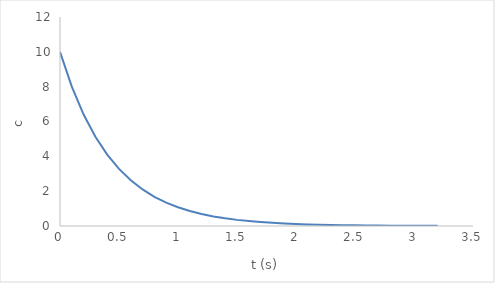
| Category | c |
|---|---|
| 0.0 | 10 |
| 0.1 | 8 |
| 0.2 | 6.4 |
| 0.30000000000000004 | 5.12 |
| 0.4 | 4.096 |
| 0.5 | 3.277 |
| 0.6 | 2.621 |
| 0.7 | 2.097 |
| 0.7999999999999999 | 1.678 |
| 0.8999999999999999 | 1.342 |
| 0.9999999999999999 | 1.074 |
| 1.0999999999999999 | 0.859 |
| 1.2 | 0.687 |
| 1.3 | 0.55 |
| 1.4000000000000001 | 0.44 |
| 1.5000000000000002 | 0.352 |
| 1.6000000000000003 | 0.281 |
| 1.7000000000000004 | 0.225 |
| 1.8000000000000005 | 0.18 |
| 1.9000000000000006 | 0.144 |
| 2.0000000000000004 | 0.115 |
| 2.1000000000000005 | 0.092 |
| 2.2000000000000006 | 0.074 |
| 2.3000000000000007 | 0.059 |
| 2.400000000000001 | 0.047 |
| 2.500000000000001 | 0.038 |
| 2.600000000000001 | 0.03 |
| 2.700000000000001 | 0.024 |
| 2.800000000000001 | 0.019 |
| 2.9000000000000012 | 0.015 |
| 3.0000000000000013 | 0.012 |
| 3.1000000000000014 | 0.01 |
| 3.2000000000000015 | 0.008 |